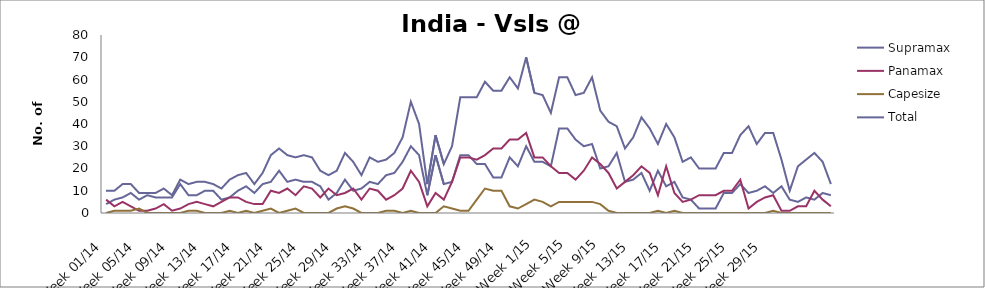
| Category | Supramax | Panamax | Capesize | Total |
|---|---|---|---|---|
| Week 01/14 | 4 | 6 | 0 | 10 |
| Week 02/14 | 6 | 3 | 1 | 10 |
| Week 03/14 | 7 | 5 | 1 | 13 |
| Week 04/14 | 9 | 3 | 1 | 13 |
| Week 05/14 | 6 | 1 | 2 | 9 |
| Week 06/14 | 8 | 1 | 0 | 9 |
| Week 07/14 | 7 | 2 | 0 | 9 |
| Week 08/14 | 7 | 4 | 0 | 11 |
| Week 09/14 | 7 | 1 | 0 | 8 |
| Week 10/14 | 13 | 2 | 0 | 15 |
| Week 11/14 | 8 | 4 | 1 | 13 |
| Week 12/14 | 8 | 5 | 1 | 14 |
| Week 13/14 | 10 | 4 | 0 | 14 |
| Week 14/14 | 10 | 3 | 0 | 13 |
| Week 15/14 | 6 | 5 | 0 | 11 |
| Week 16/14 | 7 | 7 | 1 | 15 |
| Week 17/14 | 10 | 7 | 0 | 17 |
| Week 18/14 | 12 | 5 | 1 | 18 |
| Week 19/14 | 9 | 4 | 0 | 13 |
| Week 20/14 | 13 | 4 | 1 | 18 |
| Week 21/14 | 14 | 10 | 2 | 26 |
| Week 22/14 | 19 | 9 | 0 | 29 |
| Week 23/14 | 14 | 11 | 1 | 26 |
| Week 24/14 | 15 | 8 | 2 | 25 |
| Week 25/14 | 14 | 12 | 0 | 26 |
| Week 26/14 | 14 | 11 | 0 | 25 |
| Week 27/14 | 12 | 7 | 0 | 19 |
| Week 28/14 | 6 | 11 | 0 | 17 |
| Week 29/14 | 9 | 8 | 2 | 19 |
| Week 30/14 | 15 | 9 | 3 | 27 |
| Week 31/14 | 10 | 11 | 2 | 23 |
| Week 32/14 | 11 | 6 | 0 | 17 |
| Week 33/14 | 14 | 11 | 0 | 25 |
| Week 34/14 | 13 | 10 | 0 | 23 |
| Week 35/14 | 17 | 6 | 1 | 24 |
| Week 36/14 | 18 | 8 | 1 | 27 |
| Week 37/14 | 23 | 11 | 0 | 34 |
| Week 38/14 | 30 | 19 | 1 | 50 |
| Week 39/14 | 26 | 14 | 0 | 40 |
| Week 40/14 | 8 | 3 | 0 | 13 |
| Week 41/14 | 26 | 9 | 0 | 35 |
| Week 42/14 | 13 | 6 | 3 | 22 |
| Week 43/14 | 14 | 14 | 2 | 30 |
| Week 44/14 | 26 | 25 | 1 | 52 |
| Week 45/14 | 26 | 25 | 1 | 52 |
| Week 46/14 | 22 | 24 | 6 | 52 |
| Week 47/14 | 22 | 26 | 11 | 59 |
| Week 48/14 | 16 | 29 | 10 | 55 |
| Week 49/14 | 16 | 29 | 10 | 55 |
| Week 50/14 | 25 | 33 | 3 | 61 |
| Week 51/14 | 21 | 33 | 2 | 56 |
| Week 52/14 | 30 | 36 | 4 | 70 |
| Week 1/15 | 23 | 25 | 6 | 54 |
| Week 2/15 | 23 | 25 | 5 | 53 |
| Week 3/15 | 21 | 21 | 3 | 45 |
| Week 4/15 | 38 | 18 | 5 | 61 |
| Week 5/15 | 38 | 18 | 5 | 61 |
| Week 6/15 | 33 | 15 | 5 | 53 |
| Week 7/15 | 30 | 19 | 5 | 54 |
| Week 8/15 | 31 | 25 | 5 | 61 |
| Week 9/15 | 20 | 22 | 4 | 46 |
| Week 10/15 | 21 | 18 | 1 | 41 |
| Week 11/15 | 27 | 11 | 0 | 39 |
| Week 12/15 | 14 | 14 | 0 | 29 |
| Week 13/15 | 15 | 17 | 0 | 34 |
| Week 14/15 | 18 | 21 | 0 | 43 |
| Week 15/15 | 10 | 18 | 0 | 38 |
| Week 16/15 | 19 | 8 | 1 | 31 |
| Week 17/15 | 12 | 21 | 0 | 40 |
| Week 18/15 | 14 | 9 | 1 | 34 |
| Week 19/15 | 7 | 5 | 0 | 23 |
| Week 20/15 | 6 | 6 | 0 | 25 |
| Week 21/15 | 2 | 8 | 0 | 20 |
| Week 22/15 | 2 | 8 | 0 | 20 |
| Week 23/15 | 2 | 8 | 0 | 20 |
| Week 24/15 | 9 | 10 | 0 | 27 |
| Week 25/15 | 9 | 10 | 0 | 27 |
| Week 26/15 | 13 | 15 | 0 | 35 |
| Week 27/15 | 9 | 2 | 0 | 39 |
| Week 28/15 | 10 | 5 | 0 | 31 |
| Week 29/15 | 12 | 7 | 0 | 36 |
| Week 30/15 | 9 | 8 | 1 | 36 |
| Week 31/15 | 12 | 1 | 0 | 24 |